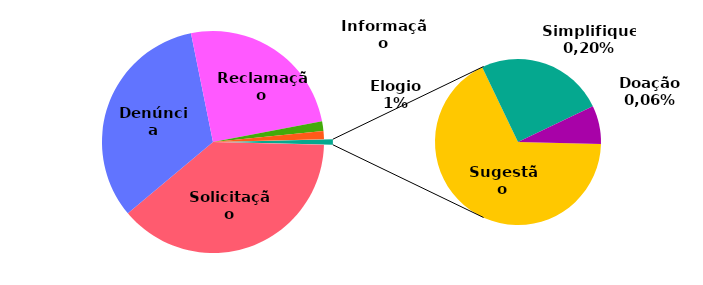
| Category | Series 0 |
|---|---|
| Solicitação | 1934 |
| Denúncia | 1652 |
| Reclamação | 1265 |
| Informação | 71 |
| Elogio | 59 |
| Sugestão | 27 |
| Simplifique | 10 |
| Doação | 3 |